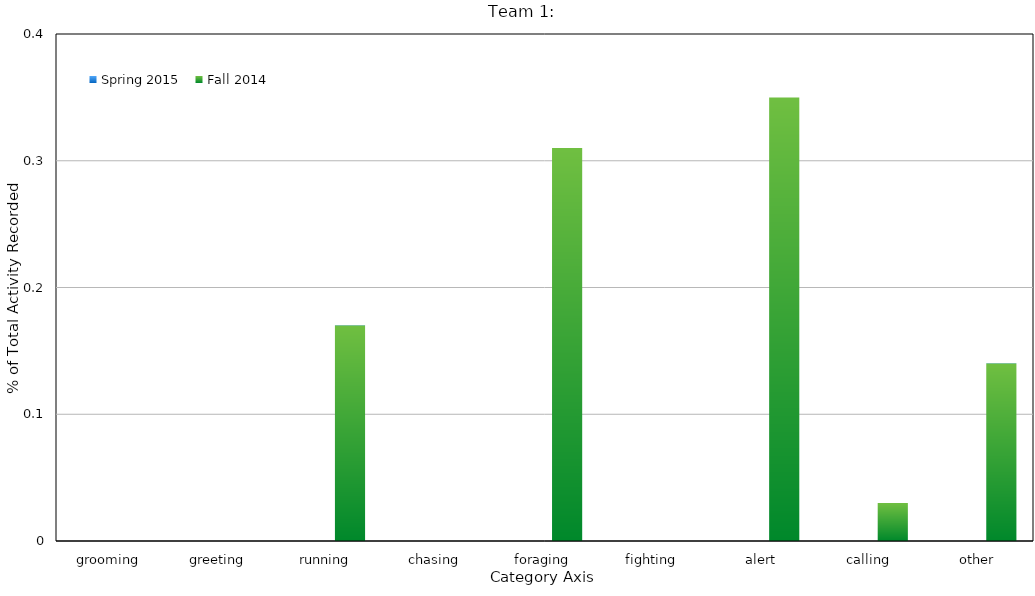
| Category | Spring 2015 | Fall 2014 |
|---|---|---|
| grooming |  | 0 |
| greeting |  | 0 |
| running |  | 0.17 |
| chasing |  | 0 |
| foraging |  | 0.31 |
| fighting |  | 0 |
| alert |  | 0.35 |
| calling |  | 0.03 |
| other |  | 0.14 |